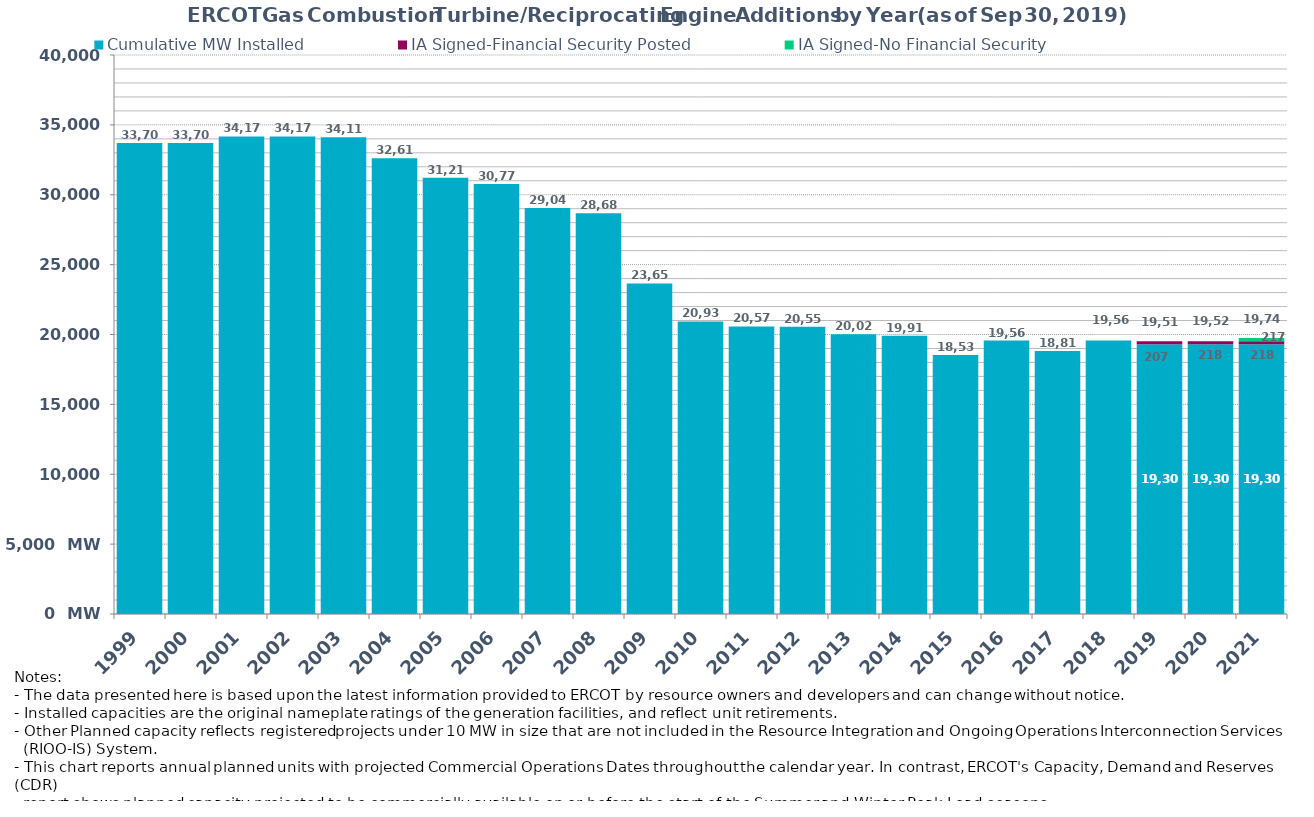
| Category | Cumulative MW Installed | IA Signed-Financial Security Posted  | IA Signed-No Financial Security  | Other Planned | Cumulative Installed and Planned |
|---|---|---|---|---|---|
| 1999.0 | 33703 | 0 | 0 | 0 | 33703 |
| 2000.0 | 33703 | 0 | 0 | 0 | 33703 |
| 2001.0 | 34170 | 0 | 0 | 0 | 34170 |
| 2002.0 | 34170 | 0 | 0 | 0 | 34170 |
| 2003.0 | 34118 | 0 | 0 | 0 | 34118 |
| 2004.0 | 32616 | 0 | 0 | 0 | 32616 |
| 2005.0 | 31217 | 0 | 0 | 0 | 31217 |
| 2006.0 | 30774 | 0 | 0 | 0 | 30774 |
| 2007.0 | 29048 | 0 | 0 | 0 | 29048 |
| 2008.0 | 28681 | 0 | 0 | 0 | 28681 |
| 2009.0 | 23651 | 0 | 0 | 0 | 23651 |
| 2010.0 | 20937 | 0 | 0 | 0 | 20937 |
| 2011.0 | 20575 | 0 | 0 | 0 | 20575 |
| 2012.0 | 20551 | 0 | 0 | 0 | 20551 |
| 2013.0 | 20026 | 0 | 0 | 0 | 20026 |
| 2014.0 | 19917 | 0 | 0 | 0 | 19917 |
| 2015.0 | 18538 | 0 | 0 | 0 | 18538 |
| 2016.0 | 19564 | 0 | 0 | 0 | 19564 |
| 2017.0 | 18818 | 0 | 0 | 0 | 18818 |
| 2018.0 | 19562 | 0 | 0 | 0 | 19562 |
| 2019.0 | 19307.3 | 207 | 0 | 0 | 19514.3 |
| 2020.0 | 19307.3 | 218 | 0 | 0 | 19525.3 |
| 2021.0 | 19307.3 | 218 | 217 | 0 | 19742.3 |